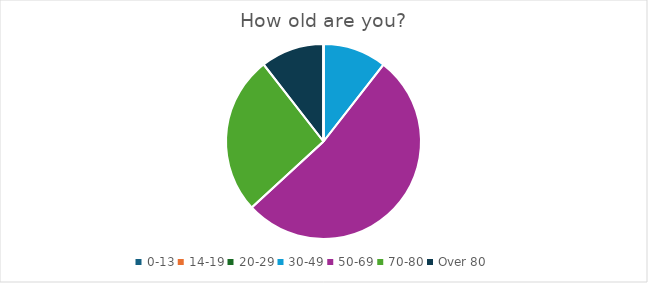
| Category | Series 0 |
|---|---|
| 0-13 | 0 |
| 14-19 | 0 |
| 20-29 | 0 |
| 30-49 | 2 |
| 50-69 | 10 |
| 70-80 | 5 |
| Over 80 | 2 |